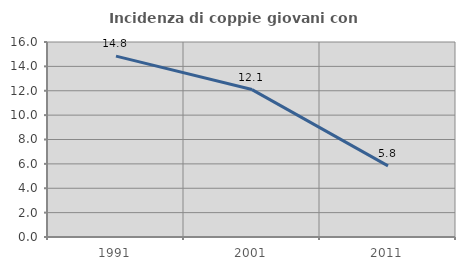
| Category | Incidenza di coppie giovani con figli |
|---|---|
| 1991.0 | 14.844 |
| 2001.0 | 12.097 |
| 2011.0 | 5.833 |